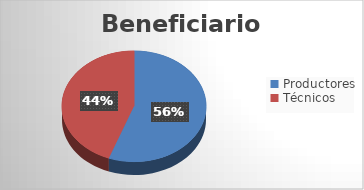
| Category | Series 0 |
|---|---|
| Productores | 295 |
| Técnicos | 235 |